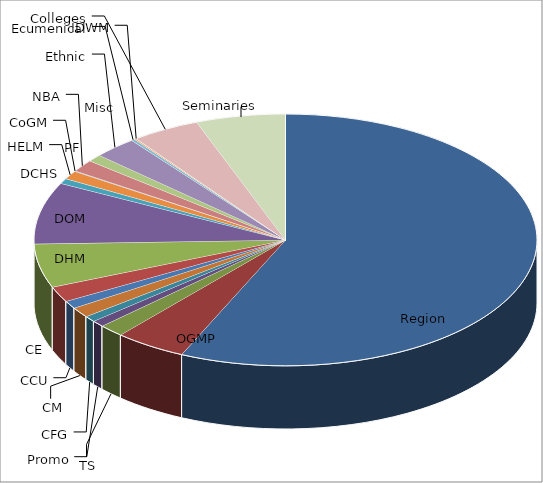
| Category | Series 0 |
|---|---|
| Region | 993.575 |
| OGMP | 80.835 |
| TS | 28.236 |
| Promo | 14.34 |
| CFG | 13.22 |
| CM | 23.018 |
| CCU | 17.491 |
| CE | 34.772 |
| DHM | 98.262 |
| DOM | 138.628 |
| DCHS | 11.752 |
| HELM | 19.085 |
| CoGM | 1.251 |
| NBA | 27.172 |
| PF | 16.366 |
| Ethnic | 48.654 |
| Ecumenical | 3.974 |
| Misc | 2.299 |
| IDWM | 0 |
| Colleges | 76.494 |
| Seminaries | 100.574 |